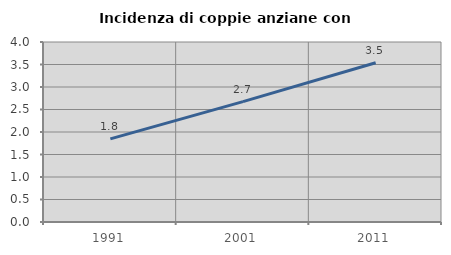
| Category | Incidenza di coppie anziane con figli |
|---|---|
| 1991.0 | 1.847 |
| 2001.0 | 2.674 |
| 2011.0 | 3.538 |